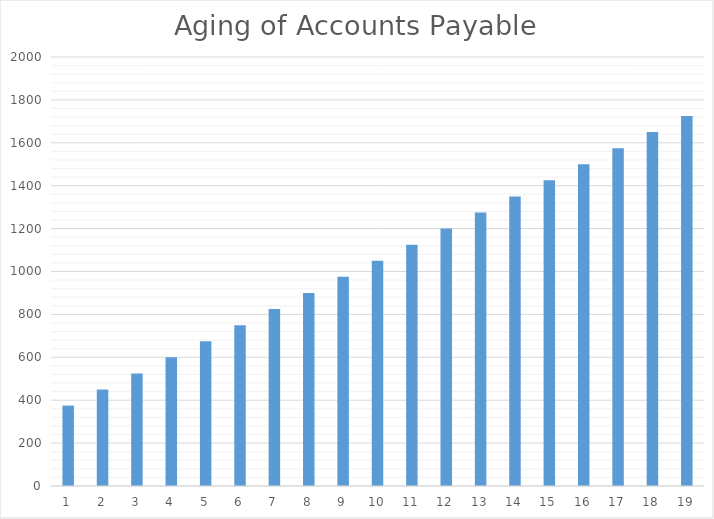
| Category | Series 0 |
|---|---|
| 0 | 375 |
| 1 | 450 |
| 2 | 525 |
| 3 | 600 |
| 4 | 675 |
| 5 | 750 |
| 6 | 825 |
| 7 | 900 |
| 8 | 975 |
| 9 | 1050 |
| 10 | 1125 |
| 11 | 1200 |
| 12 | 1275 |
| 13 | 1350 |
| 14 | 1425 |
| 15 | 1500 |
| 16 | 1575 |
| 17 | 1650 |
| 18 | 1725 |